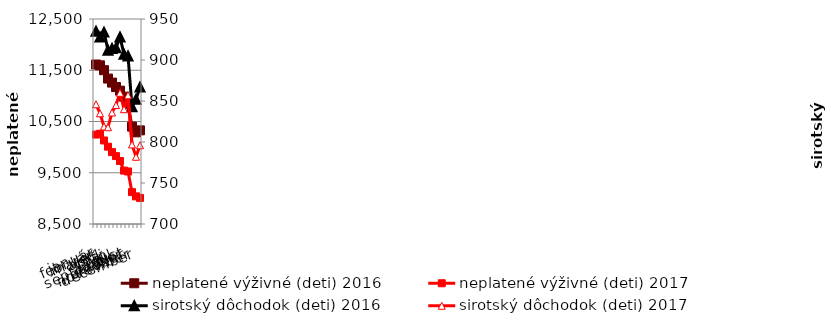
| Category | neplatené výživné (deti) 2016 | neplatené výživné (deti) 2017 |
|---|---|---|
| január | 11612 | 10245 |
| február | 11596 | 10261 |
| marec | 11501 | 10130 |
| apríl | 11338 | 10009 |
| máj | 11259 | 9903 |
| jún | 11172 | 9825 |
| júl | 11102 | 9729 |
| august | 10985 | 9542 |
| september | 10840 | 9525 |
| október | 10400 | 9122 |
| november | 10288 | 9039 |
| december | 10327 | 9009 |